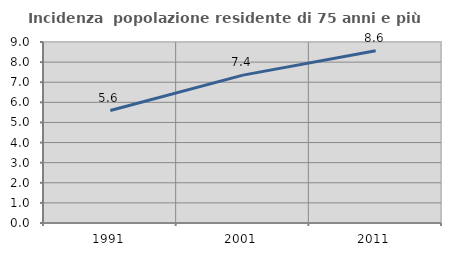
| Category | Incidenza  popolazione residente di 75 anni e più |
|---|---|
| 1991.0 | 5.592 |
| 2001.0 | 7.352 |
| 2011.0 | 8.566 |